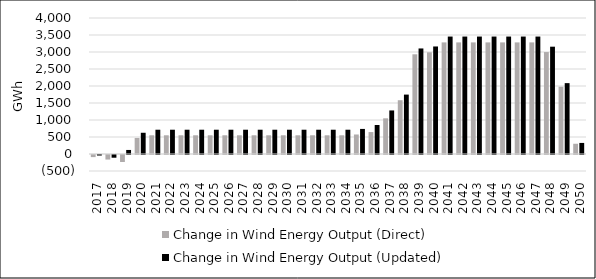
| Category | Change in Wind Energy Output (Direct) | Change in Wind Energy Output (Updated) |
|---|---|---|
| 2017.0 | -61.999 | -15.5 |
| 2018.0 | -133.725 | -79.931 |
| 2019.0 | -205.45 | 118.96 |
| 2020.0 | 472.178 | 624.517 |
| 2021.0 | 550.601 | 714.116 |
| 2022.0 | 550.601 | 714.116 |
| 2023.0 | 550.601 | 714.116 |
| 2024.0 | 550.601 | 714.116 |
| 2025.0 | 550.601 | 714.116 |
| 2026.0 | 550.601 | 714.116 |
| 2027.0 | 550.601 | 714.116 |
| 2028.0 | 550.601 | 714.116 |
| 2029.0 | 550.601 | 714.116 |
| 2030.0 | 550.601 | 714.116 |
| 2031.0 | 550.601 | 714.116 |
| 2032.0 | 550.601 | 714.116 |
| 2033.0 | 550.601 | 714.116 |
| 2034.0 | 550.601 | 714.116 |
| 2035.0 | 573.96 | 737.476 |
| 2036.0 | 645.027 | 852.341 |
| 2037.0 | 1049.165 | 1281.06 |
| 2038.0 | 1581.727 | 1747.312 |
| 2039.0 | 2932.395 | 3104.192 |
| 2040.0 | 2990.752 | 3162.548 |
| 2041.0 | 3282.535 | 3454.332 |
| 2042.0 | 3282.535 | 3454.332 |
| 2043.0 | 3282.535 | 3454.332 |
| 2044.0 | 3282.535 | 3454.332 |
| 2045.0 | 3282.535 | 3454.332 |
| 2046.0 | 3282.535 | 3454.332 |
| 2047.0 | 3282.535 | 3454.332 |
| 2048.0 | 2998.111 | 3156.252 |
| 2049.0 | 1979.261 | 2084.288 |
| 2050.0 | 301.324 | 325.554 |